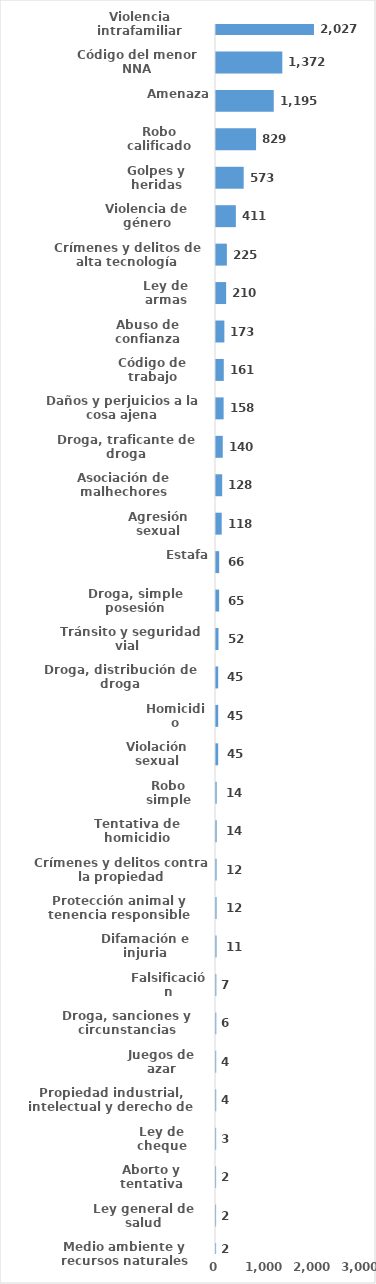
| Category | Series 0 |
|---|---|
| Violencia intrafamiliar | 2027 |
| Código del menor NNA | 1372 |
| Amenaza | 1195 |
| Robo calificado | 829 |
| Golpes y heridas | 573 |
| Violencia de género | 411 |
| Crímenes y delitos de alta tecnología | 225 |
| Ley de armas | 210 |
| Abuso de confianza | 173 |
| Código de trabajo | 161 |
| Daños y perjuicios a la cosa ajena | 158 |
| Droga, traficante de droga | 140 |
| Asociación de malhechores | 128 |
| Agresión sexual | 118 |
| Estafa | 66 |
| Droga, simple posesión | 65 |
| Tránsito y seguridad vial  | 52 |
| Droga, distribución de droga | 45 |
| Homicidio | 45 |
| Violación sexual | 45 |
| Robo simple | 14 |
| Tentativa de homicidio | 14 |
| Crímenes y delitos contra la propiedad | 12 |
| Protección animal y tenencia responsible | 12 |
| Difamación e injuria | 11 |
| Falsificación | 7 |
| Droga, sanciones y circunstancias agravantes | 6 |
| Juegos de azar | 4 |
| Propiedad industrial, intelectual y derecho de autor | 4 |
| Ley de cheque | 3 |
| Aborto y tentativa | 2 |
| Ley general de salud | 2 |
| Medio ambiente y recursos naturales | 2 |